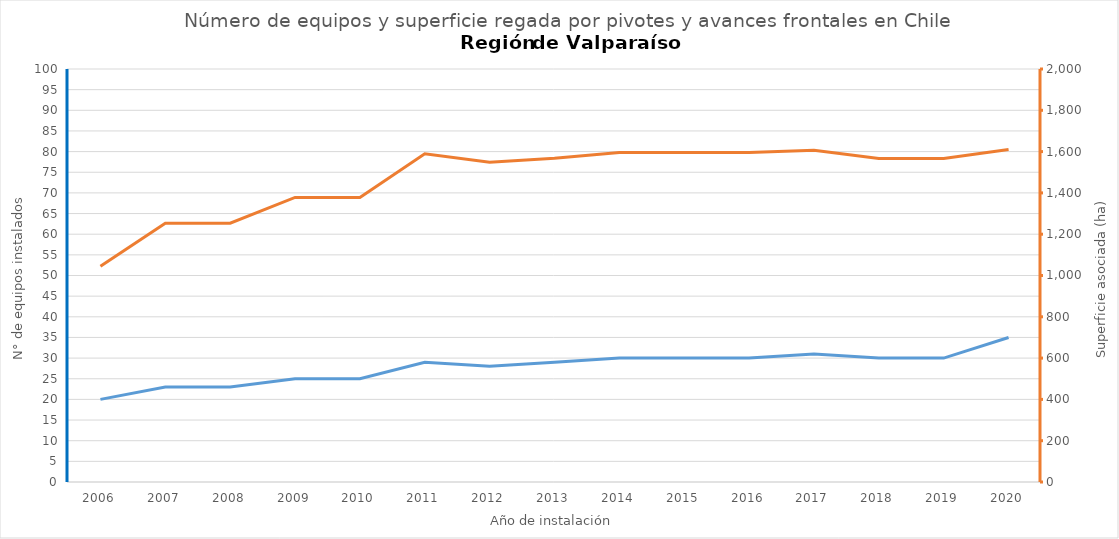
| Category | N° |
|---|---|
| 2006.0 | 20 |
| 2007.0 | 23 |
| 2008.0 | 23 |
| 2009.0 | 25 |
| 2010.0 | 25 |
| 2011.0 | 29 |
| 2012.0 | 28 |
| 2013.0 | 29 |
| 2014.0 | 30 |
| 2015.0 | 30 |
| 2016.0 | 30 |
| 2017.0 | 31 |
| 2018.0 | 30 |
| 2019.0 | 30 |
| 2020.0 | 35 |